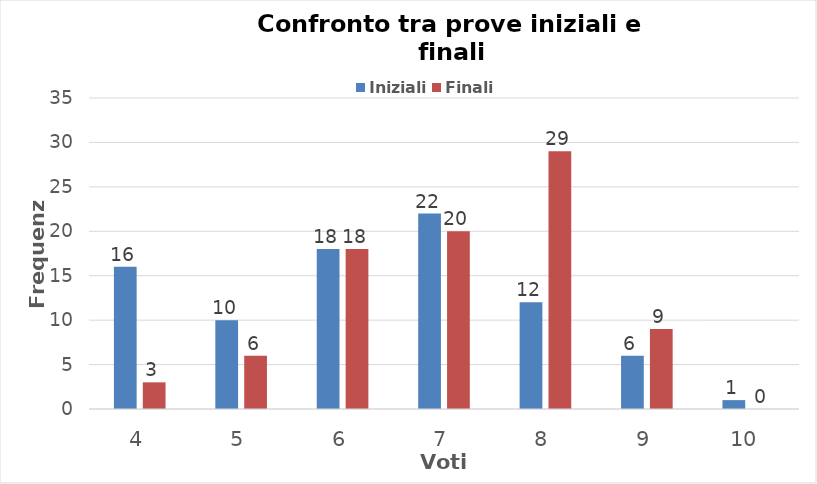
| Category | Iniziali | Finali |
|---|---|---|
| 4.0 | 16 | 3 |
| 5.0 | 10 | 6 |
| 6.0 | 18 | 18 |
| 7.0 | 22 | 20 |
| 8.0 | 12 | 29 |
| 9.0 | 6 | 9 |
| 10.0 | 1 | 0 |